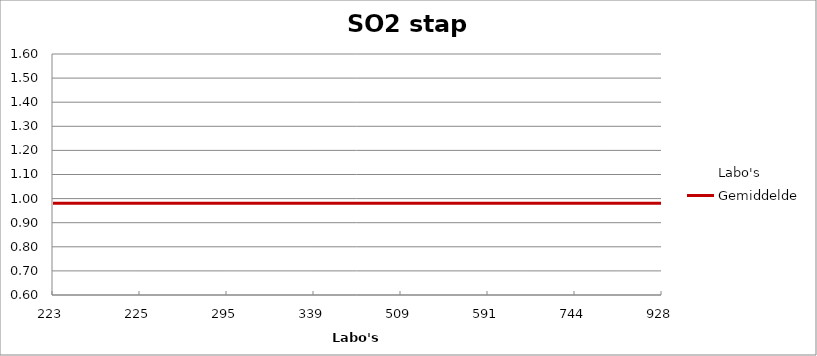
| Category | Labo's | Gemiddelde |
|---|---|---|
| 223.0 | 0.919 | 0.981 |
| 225.0 | 0.634 | 0.981 |
| 295.0 | 0.978 | 0.981 |
| 339.0 | 1.001 | 0.981 |
| 509.0 | 0.964 | 0.981 |
| 591.0 | 1.003 | 0.981 |
| 744.0 | 1.02 | 0.981 |
| 928.0 | 1.555 | 0.981 |